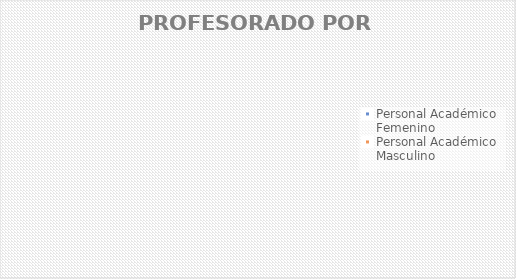
| Category | Series 0 |
|---|---|
| Personal Académico Femenino | 0 |
| Personal Académico Masculino | 0 |